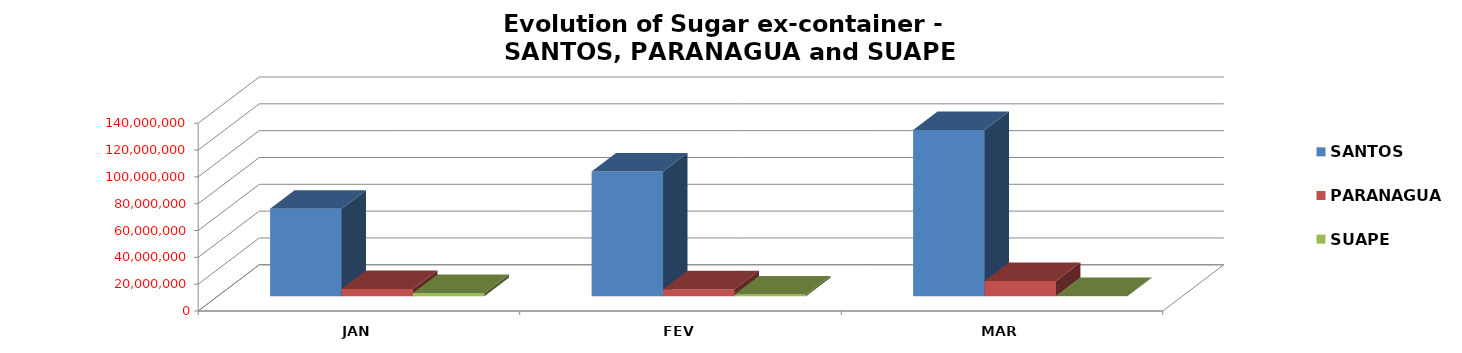
| Category | SANTOS |  PARANAGUA  |  SUAPE  |
|---|---|---|---|
| JAN | 65224734 | 5417208 | 2409686 |
| FEV | 93094017 | 5281774 | 1261109 |
| MAR | 123946317 | 11376276 | 106329 |